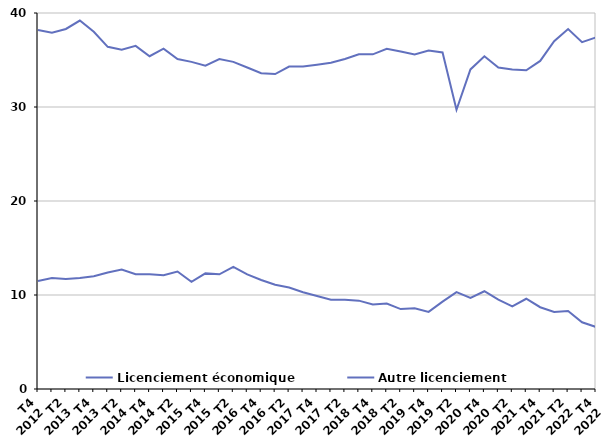
| Category | Licenciement économique | Autre licenciement |
|---|---|---|
| T4
2012 | 11.5 | 38.2 |
| T1
2013 | 11.8 | 37.9 |
| T2
2013 | 11.7 | 38.3 |
| T3
2013 | 11.8 | 39.2 |
| T4
2013 | 12 | 38 |
| T1
2014 | 12.4 | 36.4 |
| T2
2014 | 12.7 | 36.1 |
| T3
2014 | 12.2 | 36.5 |
| T4
2014 | 12.2 | 35.4 |
| T1
2015 | 12.1 | 36.2 |
| T2
2015 | 12.5 | 35.1 |
| T3
2015 | 11.4 | 34.8 |
| T4
2015 | 12.3 | 34.4 |
| T1
2016 | 12.2 | 35.1 |
| T2
2016 | 13 | 34.8 |
| T3
2016 | 12.2 | 34.2 |
| T4
2016 | 11.6 | 33.6 |
| T1
2017 | 11.1 | 33.5 |
| T2
2017 | 10.8 | 34.3 |
| T3
2017 | 10.3 | 34.3 |
| T4
2017 | 9.9 | 34.5 |
| T1
2018 | 9.5 | 34.7 |
| T2
2018 | 9.5 | 35.1 |
| T3
2018 | 9.4 | 35.6 |
| T4
2018 | 9 | 35.6 |
| T1
2019 | 9.1 | 36.2 |
| T2
2019 | 8.5 | 35.9 |
| T3
2019 | 8.6 | 35.6 |
| T4
2019 | 8.2 | 36 |
| T1
2020 | 9.3 | 35.8 |
| T2
2020 | 10.3 | 29.7 |
| T3
2020 | 9.7 | 34 |
| T4
2020 | 10.4 | 35.4 |
| T1
2021 | 9.5 | 34.2 |
| T2
2021 | 8.8 | 34 |
| T3
2021 | 9.6 | 33.9 |
| T4
2021 | 8.7 | 34.9 |
| T1
2022 | 8.2 | 37 |
| T2
2022 | 8.3 | 38.3 |
| T3
2022 | 7.1 | 36.9 |
| T4
2022 | 6.6 | 37.4 |